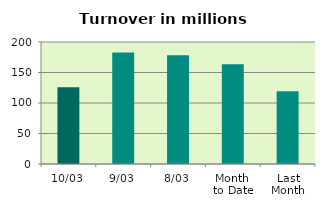
| Category | Series 0 |
|---|---|
| 10/03 | 125.855 |
| 9/03 | 182.674 |
| 8/03 | 178.119 |
| Month 
to Date | 163.498 |
| Last
Month | 119.242 |